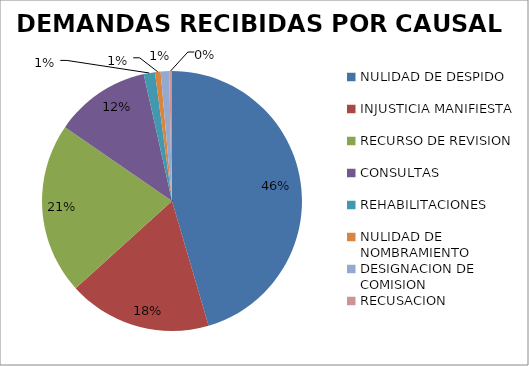
| Category | DEMANDAS RECIBIDAS POR CAUSAL  |
|---|---|
| NULIDAD DE DESPIDO | 130 |
| INJUSTICIA MANIFIESTA | 51 |
| RECURSO DE REVISION | 61 |
| CONSULTAS | 34 |
| REHABILITACIONES | 4 |
| NULIDAD DE NOMBRAMIENTO | 2 |
| DESIGNACION DE COMISION | 3 |
| RECUSACION | 1 |